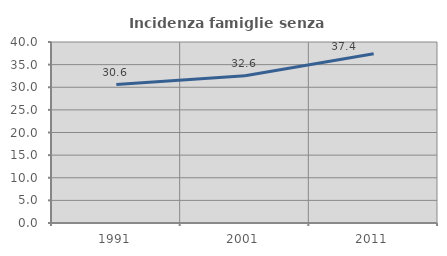
| Category | Incidenza famiglie senza nuclei |
|---|---|
| 1991.0 | 30.593 |
| 2001.0 | 32.558 |
| 2011.0 | 37.385 |